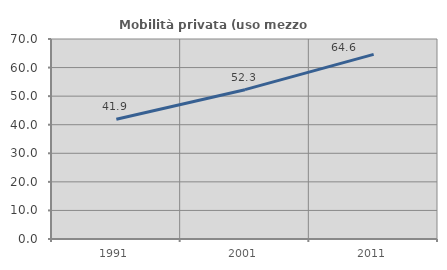
| Category | Mobilità privata (uso mezzo privato) |
|---|---|
| 1991.0 | 41.916 |
| 2001.0 | 52.266 |
| 2011.0 | 64.608 |